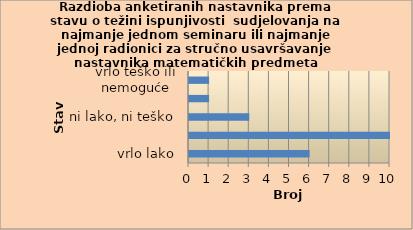
| Category | Series 0 |
|---|---|
| vrlo lako | 6 |
| lako | 10 |
| ni lako, ni teško | 3 |
| teško | 1 |
| vrlo teško ili nemoguće | 1 |